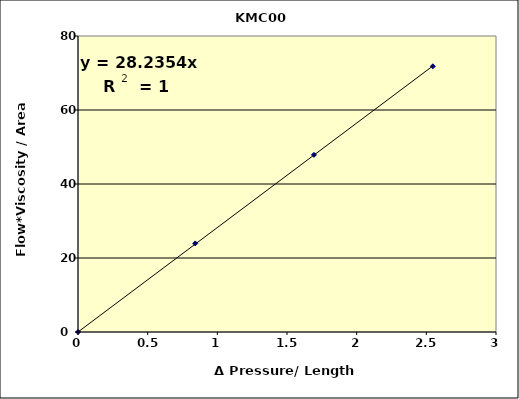
| Category | Series 0 |
|---|---|
| 0.0 | 0 |
| 0.8413168522232211 | 23.938 |
| 1.693307827951041 | 47.875 |
| 2.5470275914528733 | 71.813 |